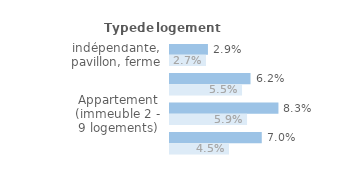
| Category | Series 1 | Series 0 |
|---|---|---|
| Maison indépendante, pavillon, ferme | 0.029 | 0.027 |
| Maison de ville groupée | 0.062 | 0.055 |
| Appartement (immeuble 2 - 9 logements) | 0.083 | 0.059 |
| Appartement (immeuble de 10 logements ou +) | 0.07 | 0.045 |